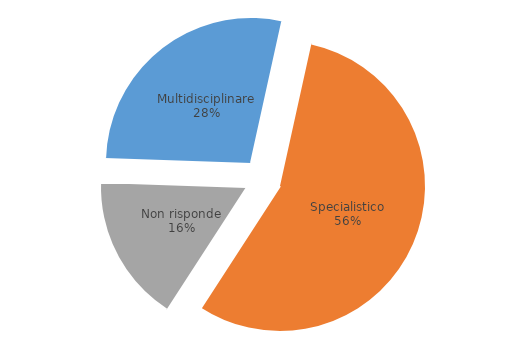
| Category | Series 0 |
|---|---|
| Multidisciplinare | 27.9 |
| Specialistico | 55.7 |
| Non risponde | 16.4 |